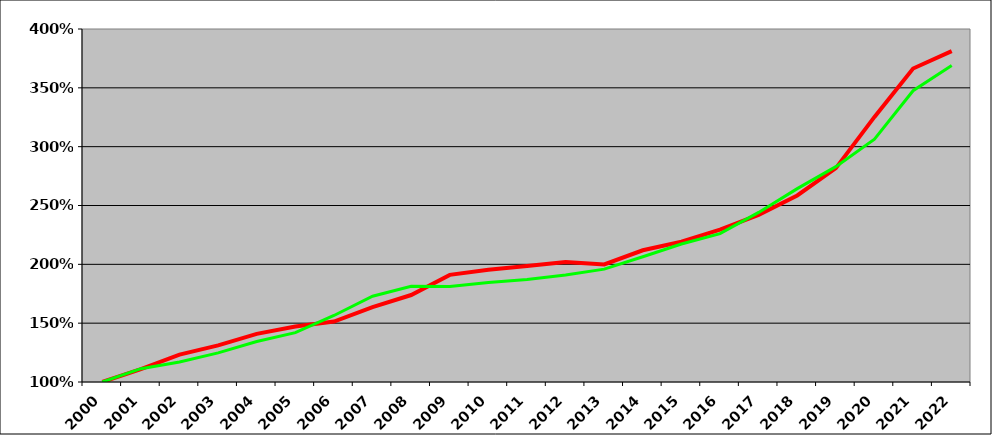
| Category | Series 0 | Náklady - kumulovaný nárůst (2000 = 100 %) | Příjmy - kumulovaný nárůst (2000 = 100 %) |
|---|---|---|---|
| 2000 | 0 | 1 | 1 |
| 2001 | 0 | 1.109 | 1.113 |
| 2002 | 0 | 1.233 | 1.17 |
| 2003 | 0 | 1.311 | 1.248 |
| 2004 | 0 | 1.409 | 1.344 |
| 2005 | 0 | 1.472 | 1.42 |
| 2006 | 0 | 1.514 | 1.565 |
| 2007 | 0 | 1.636 | 1.729 |
| 2008 | 0 | 1.739 | 1.813 |
| 2009 | 0 | 1.91 | 1.812 |
| 2010 | 0 | 1.953 | 1.846 |
| 2011 | 0 | 1.986 | 1.871 |
| 2012 | 0 | 2.021 | 1.909 |
| 2013 | 0 | 1.999 | 1.959 |
| 2014 | 0 | 2.12 | 2.064 |
| 2015 | 0 | 2.192 | 2.172 |
| 2016 | 0 | 2.295 | 2.261 |
| 2017 | 0 | 2.421 | 2.441 |
| 2018 | 0 | 2.585 | 2.644 |
| 2019 | 0 | 2.818 | 2.83 |
| 2020 | 0 | 3.253 | 3.064 |
| 2021 | 0 | 3.664 | 3.475 |
| 2022 | 0 | 3.812 | 3.69 |